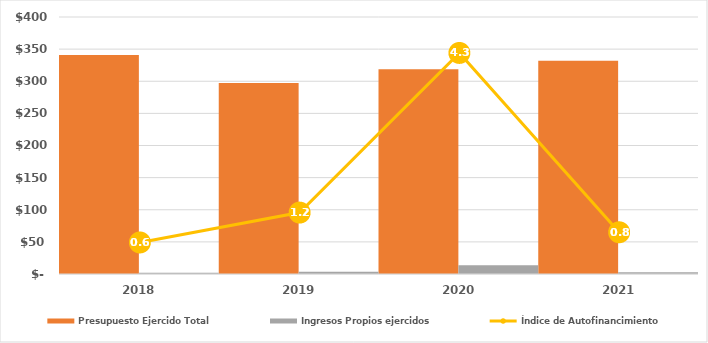
| Category | Presupuesto Ejercido Total | Ingresos Propios ejercidos |
|---|---|---|
| 2018.0 | 340765 | 2090 |
| 2019.0 | 297383.7 | 3552.847 |
| 2020.0 | 318785.247 | 13709.89 |
| 2021.0 | 331789.211 | 2693.74 |